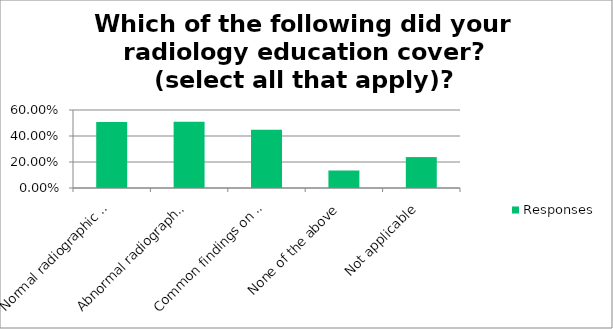
| Category | Responses |
|---|---|
| Normal radiographic anatomy | 0.507 |
| Abnormal radiographic anatomy (disease) | 0.509 |
| Common findings on radiographs (central lines / pace makers) | 0.448 |
| None of the above | 0.135 |
| Not applicable | 0.238 |